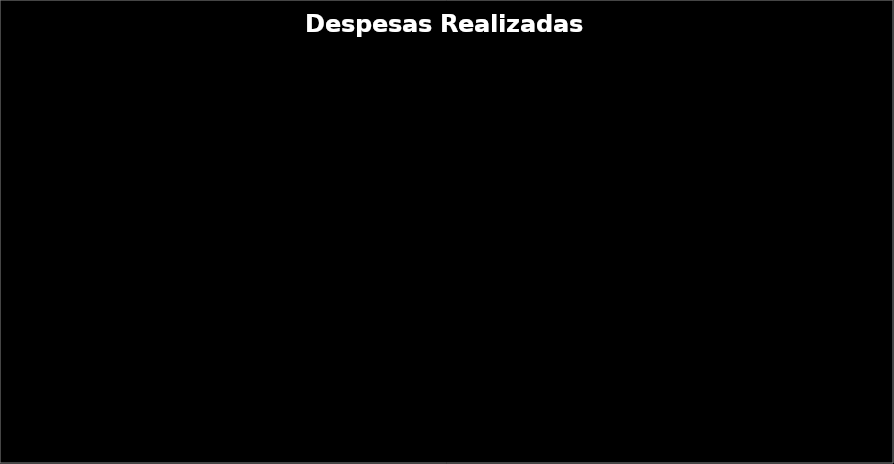
| Category | Series 0 |
|---|---|
| Renda / Prestação | 0 |
| Electricidade | 0 |
| Água | 0 |
| Gás | 0 |
| Telefone | 0 |
| Telemóveis | 0 |
| TV cabo | 0 |
| Internet | 0 |
| Condomínio | 0 |
| Supermercado | 0 |
| Seguro Casa | 0 |
| Prestação Carro | 0 |
| Combustível | 0 |
| Portagens | 0 |
| Manutenção | 0 |
| Seguro Carro | 0 |
| Propinas | 0 |
| Infantário | 0 |
| Material | 0 |
| Livros | 0 |
| Formação | 0 |
| Consultas | 0 |
| Medicamentos | 0 |
| Tratamentos | 0 |
| Exames/análises | 0 |
| Hospitalizações | 0 |
| Seguro Saúde | 0 |
| Vestuário/calçado | 0 |
| Cabeleireiro | 0 |
| Cartões de crédito | 0 |
| Transportes | 0 |
| Presentes | 0 |